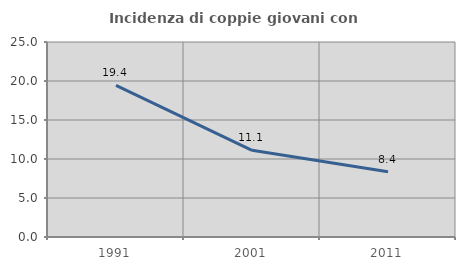
| Category | Incidenza di coppie giovani con figli |
|---|---|
| 1991.0 | 19.444 |
| 2001.0 | 11.111 |
| 2011.0 | 8.372 |